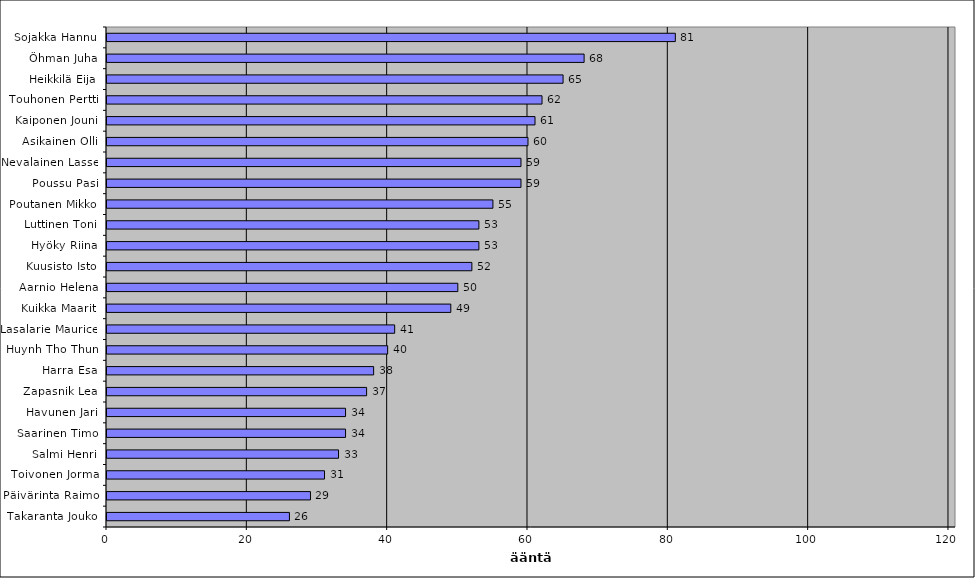
| Category | Series 0 |
|---|---|
| Sojakka Hannu | 81 |
| Öhman Juha | 68 |
| Heikkilä Eija | 65 |
| Touhonen Pertti | 62 |
| Kaiponen Jouni | 61 |
| Asikainen Olli | 60 |
| Nevalainen Lasse | 59 |
| Poussu Pasi | 59 |
| Poutanen Mikko | 55 |
| Luttinen Toni | 53 |
| Hyöky Riina | 53 |
| Kuusisto Isto | 52 |
| Aarnio Helena | 50 |
| Kuikka Maarit | 49 |
| Lasalarie Maurice | 41 |
| Huynh Tho Thun | 40 |
| Harra Esa | 38 |
| Zapasnik Lea | 37 |
| Havunen Jari | 34 |
| Saarinen Timo | 34 |
| Salmi Henri | 33 |
| Toivonen Jorma | 31 |
| Päivärinta Raimo | 29 |
| Takaranta Jouko | 26 |